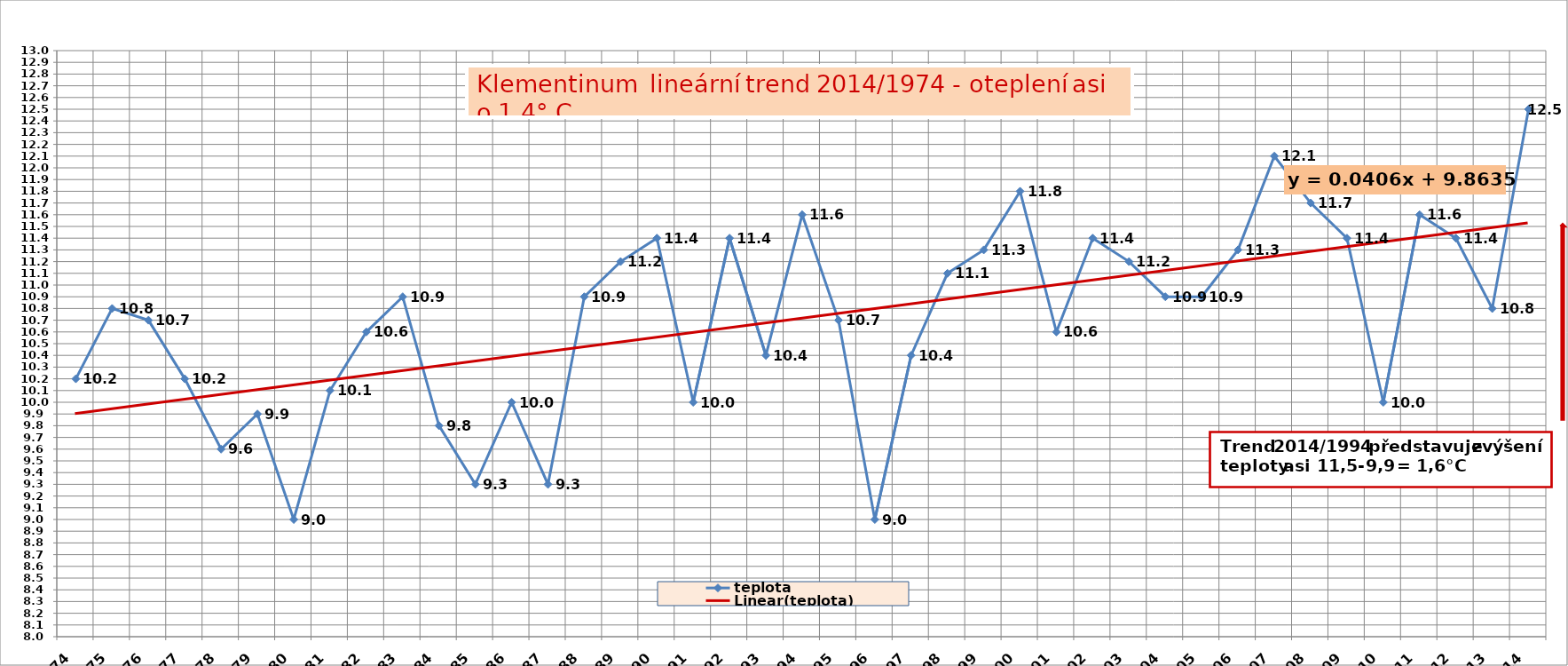
| Category | teplota |
|---|---|
| 1974.0 | 10.2 |
| 1975.0 | 10.8 |
| 1976.0 | 10.7 |
| 1977.0 | 10.2 |
| 1978.0 | 9.6 |
| 1979.0 | 9.9 |
| 1980.0 | 9 |
| 1981.0 | 10.1 |
| 1982.0 | 10.6 |
| 1983.0 | 10.9 |
| 1984.0 | 9.8 |
| 1985.0 | 9.3 |
| 1986.0 | 10 |
| 1987.0 | 9.3 |
| 1988.0 | 10.9 |
| 1989.0 | 11.2 |
| 1990.0 | 11.4 |
| 1991.0 | 10 |
| 1992.0 | 11.4 |
| 1993.0 | 10.4 |
| 1994.0 | 11.6 |
| 1995.0 | 10.7 |
| 1996.0 | 9 |
| 1997.0 | 10.4 |
| 1998.0 | 11.1 |
| 1999.0 | 11.3 |
| 2000.0 | 11.8 |
| 2001.0 | 10.6 |
| 2002.0 | 11.4 |
| 2003.0 | 11.2 |
| 2004.0 | 10.9 |
| 2005.0 | 10.9 |
| 2006.0 | 11.3 |
| 2007.0 | 12.1 |
| 2008.0 | 11.7 |
| 2009.0 | 11.4 |
| 2010.0 | 10 |
| 2011.0 | 11.6 |
| 2012.0 | 11.4 |
| 2013.0 | 10.8 |
| 2014.0 | 12.5 |